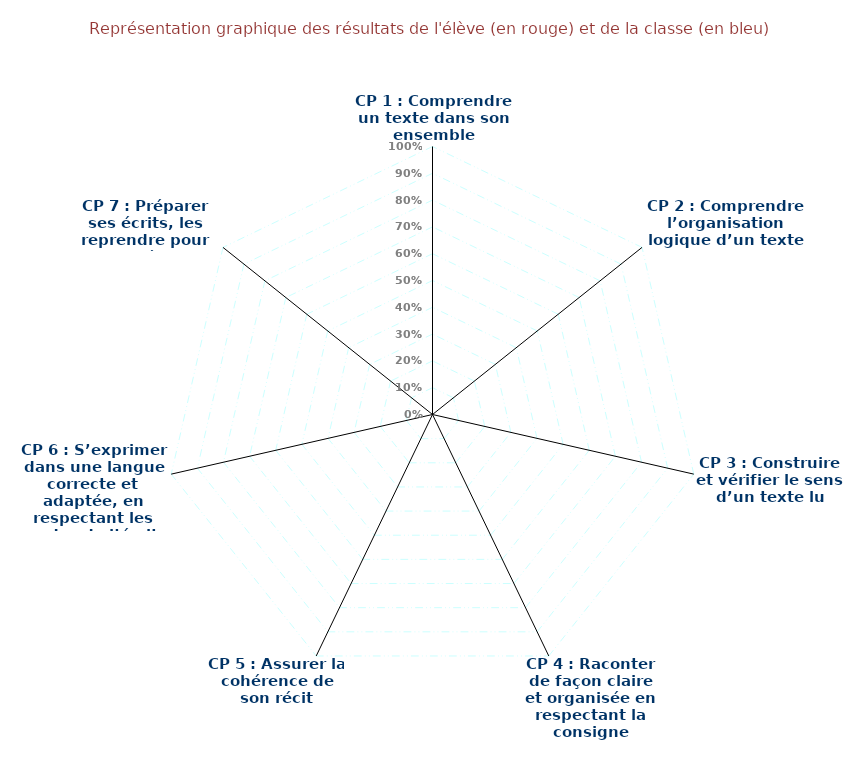
| Category | Évaluations français 5e | Series 1 |
|---|---|---|
| CP 1 : Comprendre un texte dans son ensemble | 0 | 0 |
| CP 2 : Comprendre l’organisation logique d’un texte | 0 | 0 |
| CP 3 : Construire et vérifier le sens d’un texte lu | 0 | 0 |
| CP 4 : Raconter de façon claire et organisée en respectant la consigne | 0 | 0 |
| CP 5 : Assurer la cohérence de son récit | 0 | 0 |
| CP 6 : S’exprimer dans une langue correcte et adaptée, en respectant les codes de l’écrit | 0 | 0 |
| CP 7 : Préparer ses écrits, les reprendre pour les améliorer | 0 | 0 |